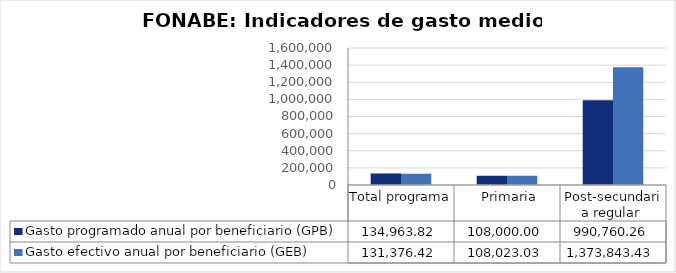
| Category | Gasto programado anual por beneficiario (GPB)  | Gasto efectivo anual por beneficiario (GEB)  |
|---|---|---|
| Total programa | 134963.822 | 131376.419 |
|   Primaria | 108000 | 108023.031 |
| Post-secundaria regular  | 990760.258 | 1373843.431 |